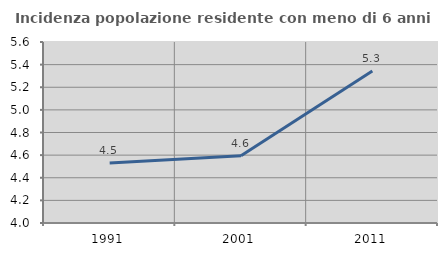
| Category | Incidenza popolazione residente con meno di 6 anni |
|---|---|
| 1991.0 | 4.531 |
| 2001.0 | 4.595 |
| 2011.0 | 5.343 |